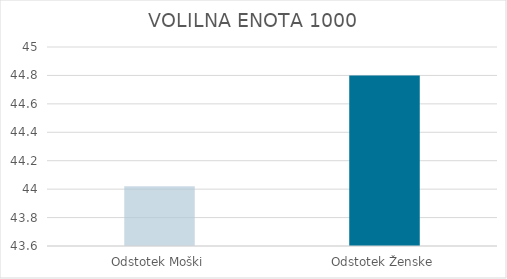
| Category | VOLILNA ENOTA 1000 |
|---|---|
| Odstotek Moški | 44.02 |
| Odstotek Ženske | 44.8 |